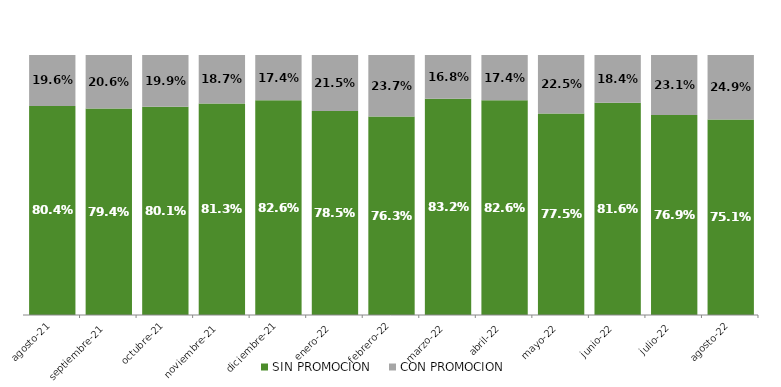
| Category | SIN PROMOCION   | CON PROMOCION   |
|---|---|---|
| 2021-08-01 | 0.804 | 0.196 |
| 2021-09-01 | 0.794 | 0.206 |
| 2021-10-01 | 0.801 | 0.199 |
| 2021-11-01 | 0.813 | 0.187 |
| 2021-12-01 | 0.826 | 0.174 |
| 2022-01-01 | 0.785 | 0.215 |
| 2022-02-01 | 0.763 | 0.237 |
| 2022-03-01 | 0.832 | 0.168 |
| 2022-04-01 | 0.826 | 0.174 |
| 2022-05-01 | 0.775 | 0.225 |
| 2022-06-01 | 0.816 | 0.184 |
| 2022-07-01 | 0.769 | 0.231 |
| 2022-08-01 | 0.751 | 0.249 |